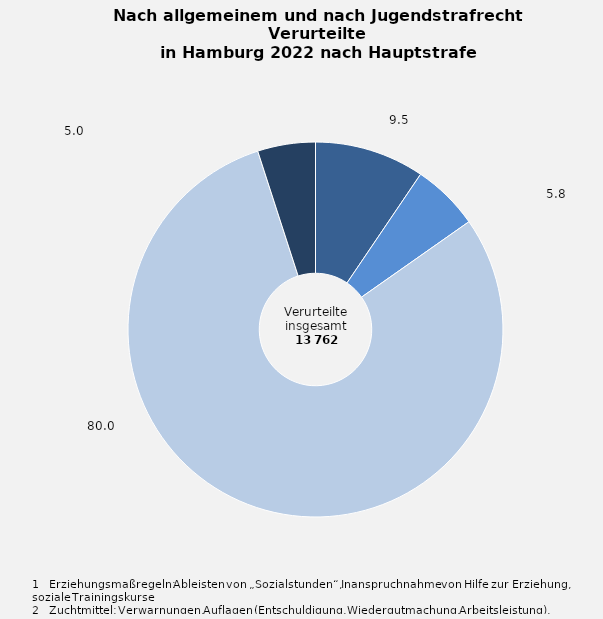
| Category | Anteil in Prozent |
|---|---|
| Freiheits- /Jugendstrafe mit 
Strafaussetzung zur Bewährung | 9.5 |
| Freiheits- /Jugendstrafe ohne 
Strafaussetzung zur Bewährung | 5.8 |
| Geldstrafe | 80 |
| Erziehungsmaßregeln¹, Zuchtmittel² | 5 |